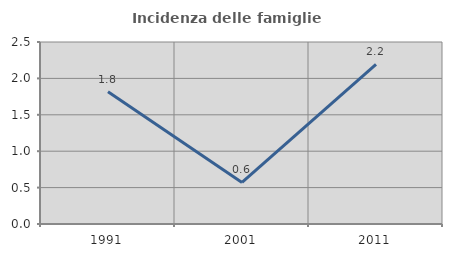
| Category | Incidenza delle famiglie numerose |
|---|---|
| 1991.0 | 1.818 |
| 2001.0 | 0.571 |
| 2011.0 | 2.193 |